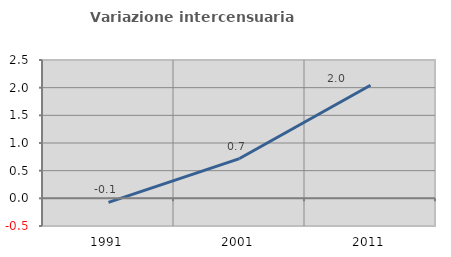
| Category | Variazione intercensuaria annua |
|---|---|
| 1991.0 | -0.073 |
| 2001.0 | 0.719 |
| 2011.0 | 2.043 |